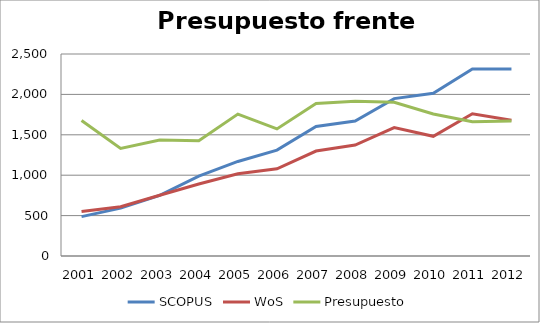
| Category | SCOPUS | WoS | Presupuesto |
|---|---|---|---|
| 2001 | 487 | 550 | 1677.787 |
| 2002 | 592 | 610 | 1332.074 |
| 2003 | 751 | 752 | 1434.238 |
| 2004 | 989 | 891 | 1427.3 |
| 2005 | 1170 | 1018 | 1756.683 |
| 2006 | 1310 | 1079 | 1572.948 |
| 2007 | 1602 | 1299 | 1886.728 |
| 2008 | 1671 | 1373 | 1914.811 |
| 2009 | 1948 | 1589 | 1903.03 |
| 2010 | 2013 | 1481 | 1758.033 |
| 2011 | 2315 | 1760 | 1662.074 |
| 2012 | 2314 | 1680 | 1671.583 |